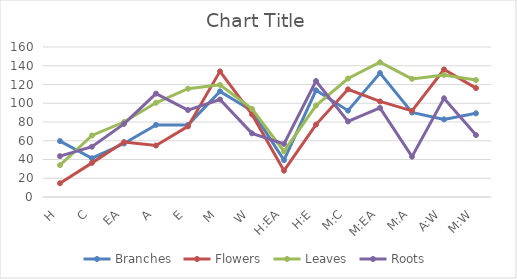
| Category | Branches  | Flowers  | Leaves  | Roots  |
|---|---|---|---|---|
| H | 59.661 | 14.69 | 33.976 | 43.619 |
| C | 41.366 | 36.41 | 65.609 | 53.623 |
| EA | 57.048 | 58.58 | 79.984 | 78.001 |
| A | 76.92 | 54.885 | 100.532 | 110.265 |
| E | 76.92 | 75.297 | 115.492 | 92.736 |
| M | 112.698 | 134.012 | 119.593 | 104.001 |
| W | 91.925 | 88.095 | 93.998 | 67.862 |
| H:EA | 39.339 | 28.118 | 48.576 | 56.642 |
| H:E | 113.825 | 77.235 | 97.558 | 123.693 |
| M:C | 92.105 | 114.861 | 126.397 | 80.615 |
| M:EA | 132.21 | 101.929 | 143.745 | 95.079 |
| M:A | 90.123 | 91.925 | 125.991 | 43.034 |
| A:W | 82.823 | 136.04 | 130.227 | 105.308 |
| M:W | 89.266 | 116.168 | 124.73 | 66.06 |